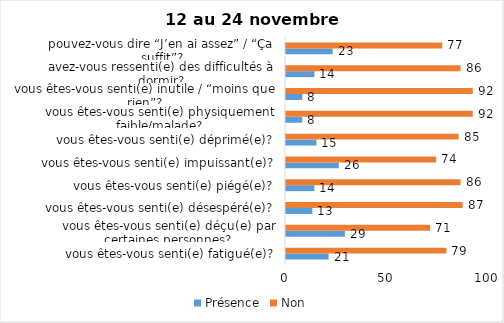
| Category | Présence | Non |
|---|---|---|
| vous êtes-vous senti(e) fatigué(e)? | 21 | 79 |
| vous êtes-vous senti(e) déçu(e) par certaines personnes? | 29 | 71 |
| vous êtes-vous senti(e) désespéré(e)? | 13 | 87 |
| vous êtes-vous senti(e) piégé(e)? | 14 | 86 |
| vous êtes-vous senti(e) impuissant(e)? | 26 | 74 |
| vous êtes-vous senti(e) déprimé(e)? | 15 | 85 |
| vous êtes-vous senti(e) physiquement faible/malade? | 8 | 92 |
| vous êtes-vous senti(e) inutile / “moins que rien”? | 8 | 92 |
| avez-vous ressenti(e) des difficultés à dormir? | 14 | 86 |
| pouvez-vous dire “J’en ai assez” / “Ça suffit”? | 23 | 77 |